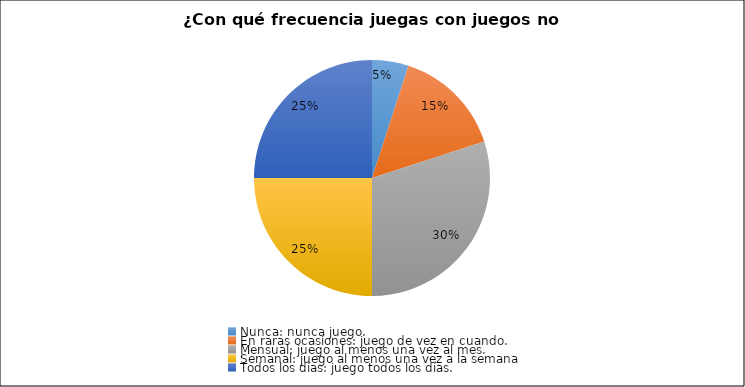
| Category | Series 0 |
|---|---|
| Nunca: nunca juego. | 1 |
| En raras ocasiones: juego de vez en cuando. | 3 |
| Mensual: juego al menos una vez al mes. | 6 |
| Semanal: juego al menos una vez a la semana | 5 |
| Todos los días: juego todos los días. | 5 |